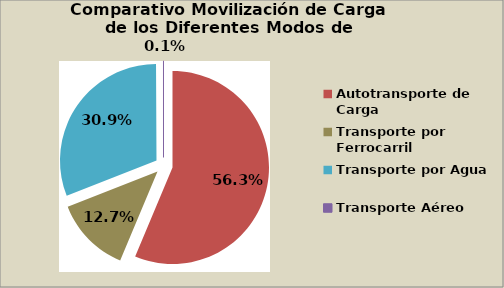
| Category | Series 0 |
|---|---|
| Autotransporte de Carga | 56.29 |
| Transporte por Ferrocarril | 12.7 |
| Transporte por Agua | 30.873 |
| Transporte Aéreo | 0.079 |